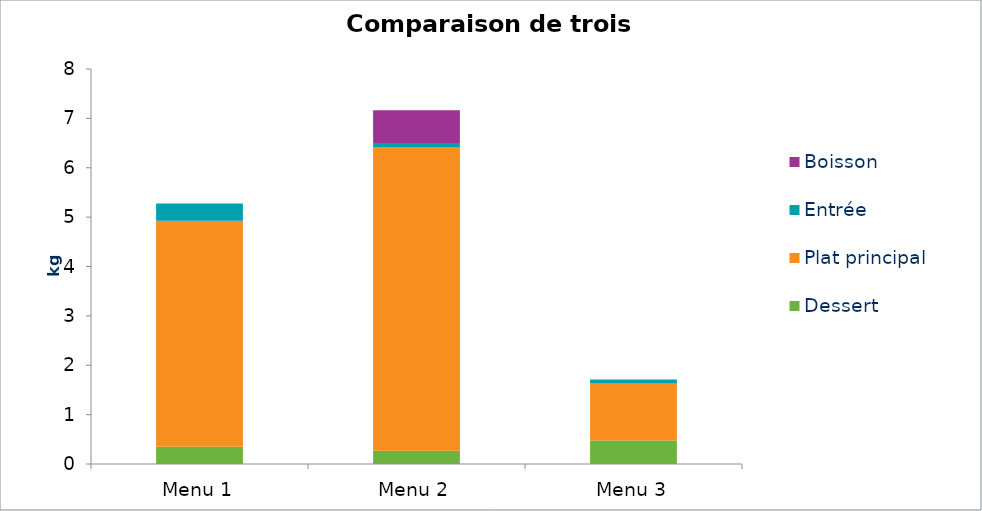
| Category | Dessert | Plat principal | Entrée | Boisson |
|---|---|---|---|---|
| Menu 1 | 0.351 | 4.575 | 0.35 | 0 |
| Menu 2 | 0.269 | 6.153 | 0.078 | 0.666 |
| Menu 3 | 0.478 | 1.155 | 0.078 | 0 |